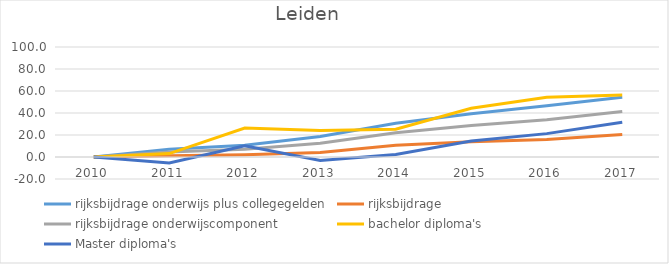
| Category | rijksbijdrage onderwijs plus collegegelden | rijksbijdrage  | rijksbijdrage onderwijscomponent | bachelor diploma's | Master diploma's |
|---|---|---|---|---|---|
| 2010.0 | 0 | 0 | 0 | 0 | 0 |
| 2011.0 | 7.051 | 1.142 | 4.494 | 3.096 | -5.345 |
| 2012.0 | 10.707 | 2.106 | 6.983 | 26.36 | 10.261 |
| 2013.0 | 18.585 | 4.07 | 12.508 | 24.1 | -3.068 |
| 2014.0 | 30.655 | 10.782 | 22.066 | 25.188 | 2.243 |
| 2015.0 | 39.248 | 13.888 | 28.561 | 44.31 | 14.517 |
| 2016.0 | 46.505 | 15.923 | 33.949 | 54.268 | 21.247 |
| 2017.0 | 54.367 | 20.457 | 41.283 | 56.36 | 31.607 |